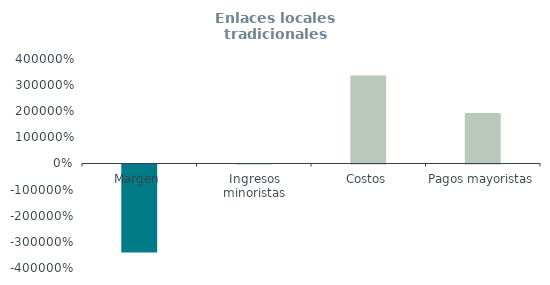
| Category | Enlaces locales tradicionales
(% ingresos) |
|---|---|
| Margen | -3366.943 |
| Ingresos minoristas | 1 |
| Costos | 3367.943 |
| Pagos mayoristas | 1933.094 |